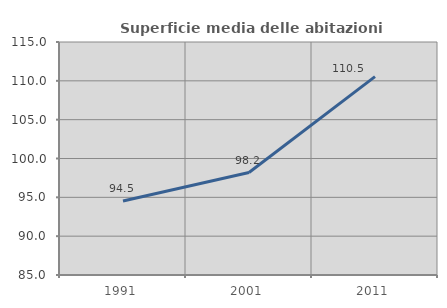
| Category | Superficie media delle abitazioni occupate |
|---|---|
| 1991.0 | 94.531 |
| 2001.0 | 98.195 |
| 2011.0 | 110.549 |